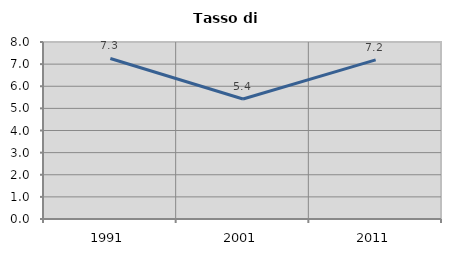
| Category | Tasso di disoccupazione   |
|---|---|
| 1991.0 | 7.257 |
| 2001.0 | 5.425 |
| 2011.0 | 7.19 |